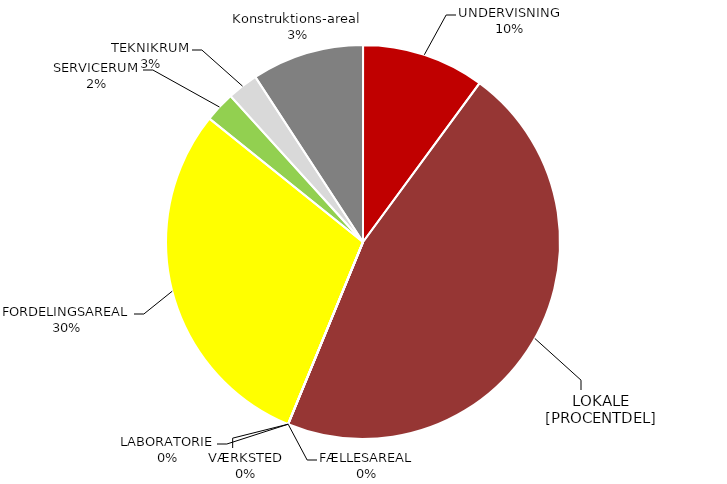
| Category | Series 0 |
|---|---|
| UNDERVISNING | 273.314 |
| NORMALLOKALE | 1251.179 |
| FÆLLESAREAL | 0 |
| LABORATORIE | 0 |
| VÆRKSTED | 0 |
| FORDELINGSAREAL | 801.668 |
| SERVICERUM | 67.846 |
| TEKNIKRUM | 68.632 |
| KONSTRUKTION | 249.761 |